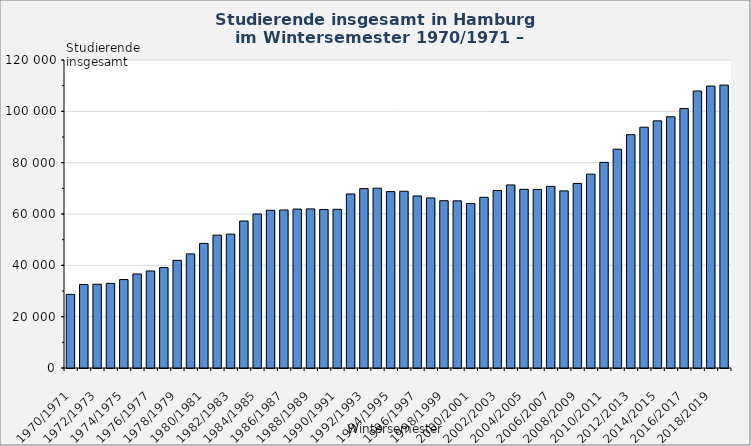
| Category | Studierende insgesamt |
|---|---|
| 1970/1971 | 28686 |
| 1971/1972 | 32538 |
| 1972/1973 | 32631 |
| 1973/1974 | 32976 |
| 1974/1975 | 34461 |
| 1975/1976 | 36633 |
| 1976/1977 | 37816 |
| 1977/1978 | 39148 |
| 1978/1979 | 41936 |
| 1979/1980 | 44464 |
| 1980/1981 | 48552 |
| 1981/1982 | 51758 |
| 1982/1983 | 52153 |
| 1983/1984 | 57264 |
| 1984/1985 | 59994 |
| 1985/1986 | 61443 |
| 1986/1987 | 61574 |
| 1987/1988 | 61926 |
| 1988/1989 | 61993 |
| 1989/1990 | 61764 |
| 1990/1991 | 61827 |
| 1991/1992 | 67805 |
| 1992/1993 | 69892 |
| 1993/1994 | 70052 |
| 1994/1995 | 68720 |
| 1995/1996 | 68868 |
| 1996/1997 | 67032 |
| 1997/1998 | 66262 |
| 1998/1999 | 65175 |
| 1999/2000 | 65115 |
| 2000/2001 | 64083 |
| 2001/2002 | 66513 |
| 2002/2003 | 69180 |
| 2003/2004 | 71319 |
| 2004/2005 | 69618 |
| 2005/2006 | 69573 |
| 2006/2007 | 70761 |
| 2007/2008 | 69009 |
| 2008/2009 | 71910 |
| 2009/2010 | 75513 |
| 2010/2011 | 80115 |
| 2011/2012 | 85242 |
| 2012/2013 | 90903 |
| 2013/2014 | 93813 |
| 2014/2015 | 96285 |
| 2015/2016 | 97881 |
| 2016/2017 | 101070 |
| 2017/2018 | 107913 |
| 2018/2019 | 109842 |
| 2019/2020 | 110220 |